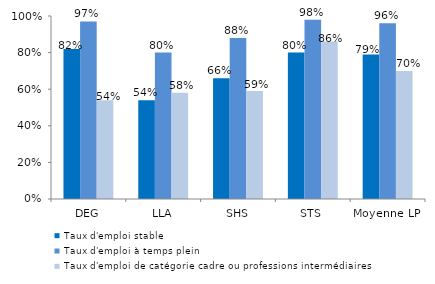
| Category | Taux d'emploi stable | Taux d'emploi à temps plein | Taux d'emploi de catégorie cadre ou professions intermédiaires |
|---|---|---|---|
| DEG | 0.82 | 0.97 | 0.54 |
| LLA | 0.54 | 0.8 | 0.58 |
| SHS | 0.66 | 0.88 | 0.59 |
| STS | 0.8 | 0.98 | 0.86 |
| Moyenne LP | 0.79 | 0.96 | 0.7 |